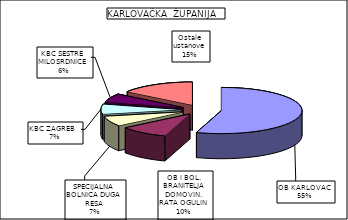
| Category | Series 0 |
|---|---|
| OB KARLOVAC | 55.025 |
| OB I BOL. BRANITELJA DOMOVIN. RATA OGULIN | 9.786 |
| SPECIJALNA BOLNICA DUGA RESA | 7.104 |
| KBC ZAGREB  | 6.952 |
| KBC SESTRE MILOSRDNICE | 6.083 |
| Ostale ustanove | 15.05 |